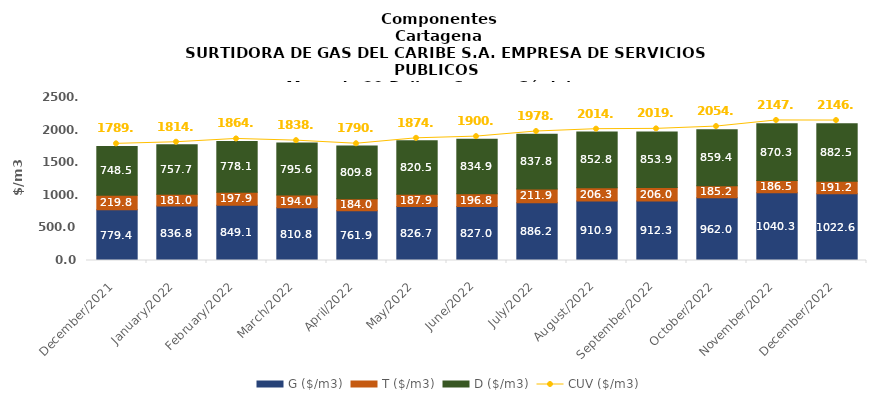
| Category | G ($/m3) | T ($/m3) | D ($/m3) |
|---|---|---|---|
| 2021-12-01 | 779.43 | 219.79 | 748.5 |
| 2022-01-01 | 836.83 | 180.95 | 757.71 |
| 2022-02-01 | 849.08 | 197.89 | 778.12 |
| 2022-03-01 | 810.81 | 194.02 | 795.6 |
| 2022-04-01 | 761.86 | 183.95 | 809.75 |
| 2022-05-01 | 826.7 | 187.86 | 820.54 |
| 2022-06-01 | 827.01 | 196.82 | 834.92 |
| 2022-07-01 | 886.17 | 211.86 | 837.8 |
| 2022-08-01 | 910.91 | 206.26 | 852.79 |
| 2022-09-01 | 912.26 | 206.01 | 853.9 |
| 2022-10-01 | 962.02 | 185.17 | 859.36 |
| 2022-11-01 | 1040.34 | 186.54 | 870.26 |
| 2022-12-01 | 1022.62 | 191.17 | 882.47 |